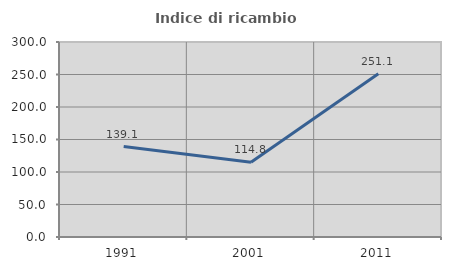
| Category | Indice di ricambio occupazionale  |
|---|---|
| 1991.0 | 139.091 |
| 2001.0 | 114.847 |
| 2011.0 | 251.111 |